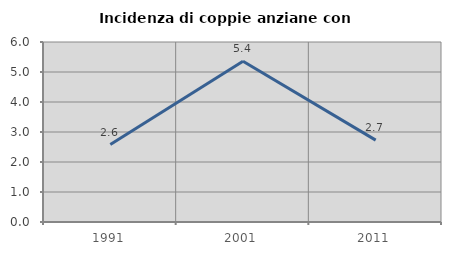
| Category | Incidenza di coppie anziane con figli |
|---|---|
| 1991.0 | 2.583 |
| 2001.0 | 5.357 |
| 2011.0 | 2.73 |